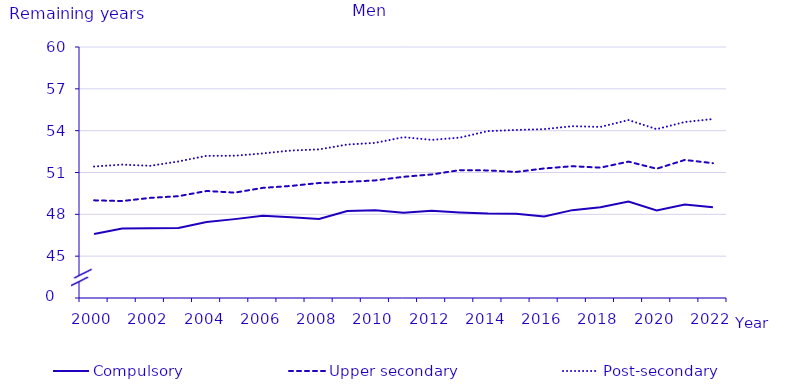
| Category | Compulsory | Upper secondary | Post-secondary |
|---|---|---|---|
| 2000.0 | 46.586 | 49.003 | 51.43 |
| 2001.0 | 46.977 | 48.953 | 51.567 |
| 2002.0 | 46.995 | 49.18 | 51.479 |
| 2003.0 | 47.018 | 49.302 | 51.794 |
| 2004.0 | 47.454 | 49.674 | 52.195 |
| 2005.0 | 47.656 | 49.557 | 52.202 |
| 2006.0 | 47.893 | 49.898 | 52.369 |
| 2007.0 | 47.79 | 50.037 | 52.577 |
| 2008.0 | 47.664 | 50.246 | 52.658 |
| 2009.0 | 48.231 | 50.328 | 53.005 |
| 2010.0 | 48.297 | 50.433 | 53.127 |
| 2011.0 | 48.107 | 50.692 | 53.534 |
| 2012.0 | 48.25 | 50.86 | 53.34 |
| 2013.0 | 48.14 | 51.17 | 53.5 |
| 2014.0 | 48.06 | 51.15 | 53.97 |
| 2015.0 | 48.05 | 51.04 | 54.05 |
| 2016.0 | 47.84 | 51.29 | 54.11 |
| 2017.0 | 48.3 | 51.45 | 54.32 |
| 2018.0 | 48.51 | 51.35 | 54.27 |
| 2019.0 | 48.92 | 51.78 | 54.76 |
| 2020.0 | 48.28 | 51.27 | 54.11 |
| 2021.0 | 48.71 | 51.9 | 54.62 |
| 2022.0 | 48.51 | 51.67 | 54.83 |